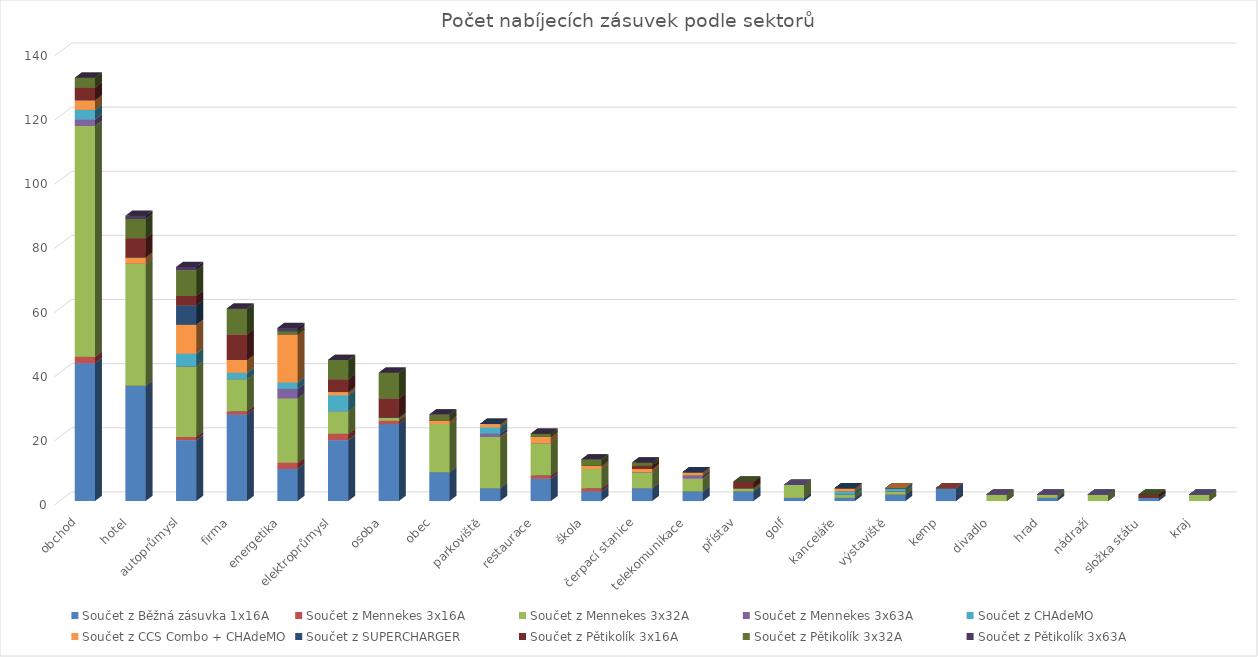
| Category | Součet z Běžná zásuvka 1x16A | Součet z Mennekes 3x16A | Součet z Mennekes 3x32A | Součet z Mennekes 3x63A | Součet z CHAdeMO | Součet z CCS Combo + CHAdeMO | Součet z SUPERCHARGER | Součet z Pětikolík 3x16A | Součet z Pětikolík 3x32A | Součet z Pětikolík 3x63A |
|---|---|---|---|---|---|---|---|---|---|---|
| obchod | 43 | 2 | 72 | 2 | 3 | 3 | 0 | 4 | 3 | 0 |
| hotel | 36 | 0 | 38 | 0 | 0 | 2 | 0 | 6 | 6 | 1 |
| autoprůmysl | 19 | 1 | 22 | 0 | 4 | 9 | 6 | 3 | 8 | 1 |
| firma | 27 | 1 | 10 | 0 | 2 | 4 | 0 | 8 | 8 | 0 |
| energetika | 10 | 2 | 20 | 3 | 2 | 15 | 0 | 0 | 1 | 1 |
| elektroprůmysl | 19 | 2 | 7 | 0 | 5 | 1 | 0 | 4 | 6 | 0 |
| osoba | 24 | 1 | 1 | 0 | 0 | 0 | 0 | 6 | 8 | 0 |
| obec | 9 | 0 | 15 | 0 | 0 | 1 | 0 | 0 | 2 | 0 |
| parkoviště | 4 | 0 | 16 | 1 | 2 | 1 | 0 | 0 | 0 | 0 |
| restaurace | 7 | 1 | 10 | 0 | 0 | 2 | 0 | 0 | 1 | 0 |
| škola | 3 | 1 | 6 | 0 | 0 | 1 | 0 | 0 | 2 | 0 |
| čerpací stanice | 4 | 0 | 5 | 0 | 0 | 1 | 0 | 1 | 1 | 0 |
| telekomunikace | 3 | 0 | 4 | 1 | 0 | 1 | 0 | 0 | 0 | 0 |
| přístav | 3 | 0 | 1 | 0 | 0 | 0 | 0 | 2 | 0 | 0 |
| golf | 1 | 0 | 4 | 0 | 0 | 0 | 0 | 0 | 0 | 0 |
| kanceláře | 1 | 0 | 1 | 0 | 1 | 1 | 0 | 0 | 0 | 0 |
| výstaviště | 2 | 0 | 1 | 0 | 1 | 0 | 0 | 0 | 0 | 0 |
| kemp | 4 | 0 | 0 | 0 | 0 | 0 | 0 | 0 | 0 | 0 |
| divadlo | 0 | 0 | 2 | 0 | 0 | 0 | 0 | 0 | 0 | 0 |
| hrad | 1 | 0 | 1 | 0 | 0 | 0 | 0 | 0 | 0 | 0 |
| nádraží | 0 | 0 | 2 | 0 | 0 | 0 | 0 | 0 | 0 | 0 |
| složka státu | 1 | 0 | 0 | 0 | 0 | 0 | 0 | 1 | 0 | 0 |
| kraj | 0 | 0 | 2 | 0 | 0 | 0 | 0 | 0 | 0 | 0 |